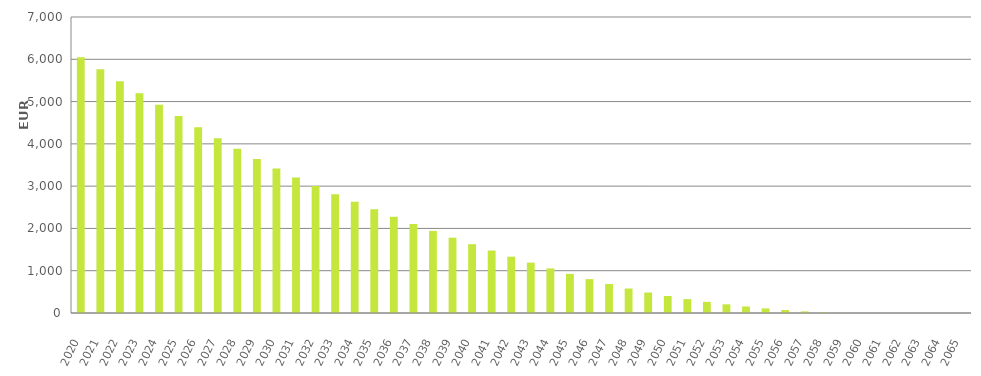
| Category | EUR Millions |
|---|---|
| 2020.0 | 6050000000.01 |
| 2021.0 | 5763348169.163 |
| 2022.0 | 5479100283.017 |
| 2023.0 | 5199279684.28 |
| 2024.0 | 4925307838.185 |
| 2025.0 | 4656893015.911 |
| 2026.0 | 4393580898.012 |
| 2027.0 | 4135508598.242 |
| 2028.0 | 3884424514.333 |
| 2029.0 | 3644812770.29 |
| 2030.0 | 3418559826.633 |
| 2031.0 | 3204213442.062 |
| 2032.0 | 3001748011.937 |
| 2033.0 | 2810997034.683 |
| 2034.0 | 2628428106.535 |
| 2035.0 | 2451055815.871 |
| 2036.0 | 2275742312.996 |
| 2037.0 | 2105324106.454 |
| 2038.0 | 1940268006.164 |
| 2039.0 | 1781306163.648 |
| 2040.0 | 1627432909.072 |
| 2041.0 | 1477360127.746 |
| 2042.0 | 1331931179.423 |
| 2043.0 | 1190725747.919 |
| 2044.0 | 1055025299.743 |
| 2045.0 | 925342288.75 |
| 2046.0 | 800953623.21 |
| 2047.0 | 684911455.438 |
| 2048.0 | 578810365.072 |
| 2049.0 | 484368794.55 |
| 2050.0 | 401469609.898 |
| 2051.0 | 328602092.011 |
| 2052.0 | 263747749.506 |
| 2053.0 | 205688824.768 |
| 2054.0 | 154242546.6 |
| 2055.0 | 108922041.805 |
| 2056.0 | 69680270.545 |
| 2057.0 | 37600441.181 |
| 2058.0 | 15075508.972 |
| 2059.0 | 3377720.147 |
| 2060.0 | 299615.947 |
| 2061.0 | 66932.172 |
| 2062.0 | 20267.267 |
| 2063.0 | 381.547 |
| 2064.0 | 0 |
| 2065.0 | 0 |